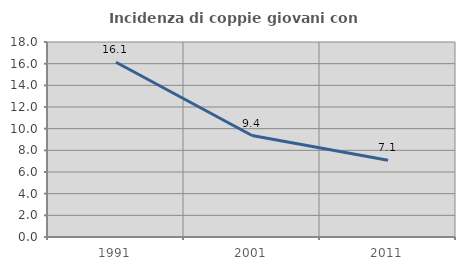
| Category | Incidenza di coppie giovani con figli |
|---|---|
| 1991.0 | 16.126 |
| 2001.0 | 9.368 |
| 2011.0 | 7.078 |